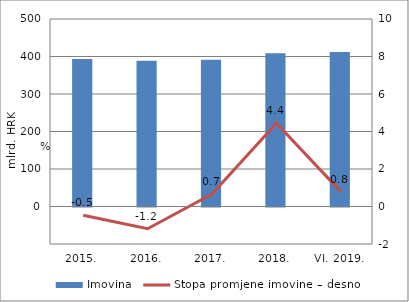
| Category | Imovina |
|---|---|
| 2015. | 393.394 |
| 2016. | 388.722 |
| 2017. | 391.304 |
| 2018. | 408.667 |
| VI. 2019. | 411.909 |